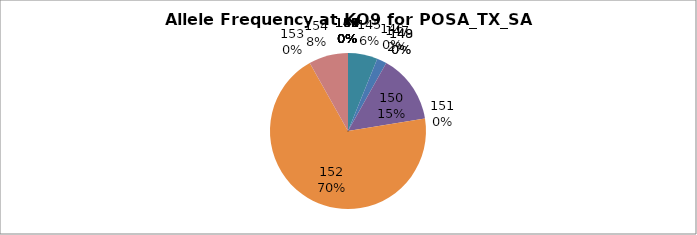
| Category | Series 0 |
|---|---|
| 140.0 | 0 |
| 141.0 | 0 |
| 142.0 | 0 |
| 143.0 | 0 |
| 145.0 | 0.061 |
| 146.0 | 0 |
| 147.0 | 0.02 |
| 148.0 | 0 |
| 149.0 | 0 |
| 150.0 | 0.143 |
| 151.0 | 0 |
| 152.0 | 0.694 |
| 153.0 | 0 |
| 154.0 | 0.082 |
| 155.0 | 0 |
| 156.0 | 0 |
| 158.0 | 0 |
| 160.0 | 0 |
| 161.0 | 0 |
| 162.0 | 0 |
| 164.0 | 0 |
| 166.0 | 0 |